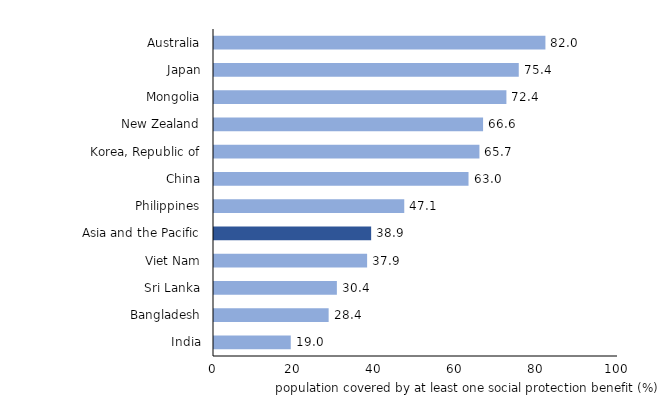
| Category | Population covered by at least one social protection benefit, % of total population |
|---|---|
| India | 19 |
| Bangladesh | 28.378 |
| Sri Lanka | 30.414 |
| Viet Nam | 37.9 |
| Asia and the Pacific | 38.9 |
| Philippines | 47.094 |
| China | 63 |
| Korea, Republic of | 65.7 |
| New Zealand | 66.604 |
| Mongolia | 72.378 |
| Japan | 75.436 |
| Australia | 82.036 |